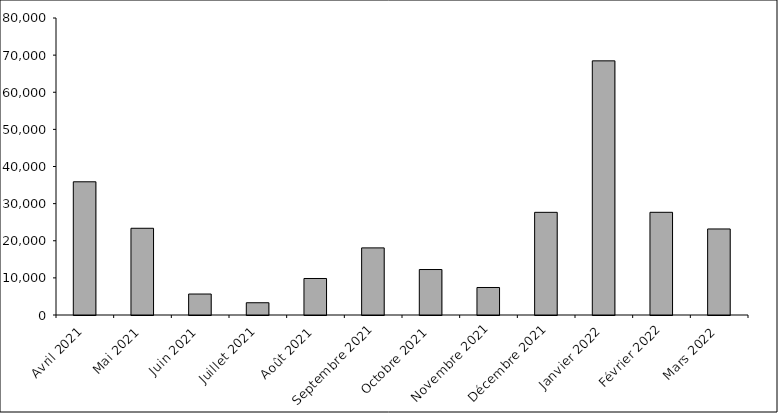
| Category | Series 0 |
|---|---|
| Avril 2021 | 35880 |
| Mai 2021 | 23359 |
| Juin 2021 | 5651 |
| Juillet 2021 | 3302 |
| Août 2021 | 9832 |
| Septembre 2021 | 18080 |
| Octobre 2021 | 12251 |
| Novembre 2021 | 7411 |
| Décembre 2021 | 27654 |
| Janvier 2022 | 68459 |
| Février 2022 | 27661 |
| Mars 2022 | 23174 |